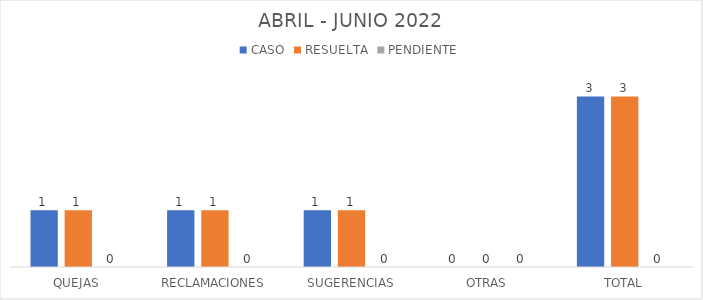
| Category | CASO | RESUELTA | PENDIENTE |
|---|---|---|---|
| QUEJAS | 1 | 1 | 0 |
| RECLAMACIONES | 1 | 1 | 0 |
| SUGERENCIAS | 1 | 1 | 0 |
| OTRAS | 0 | 0 | 0 |
| TOTAL | 3 | 3 | 0 |